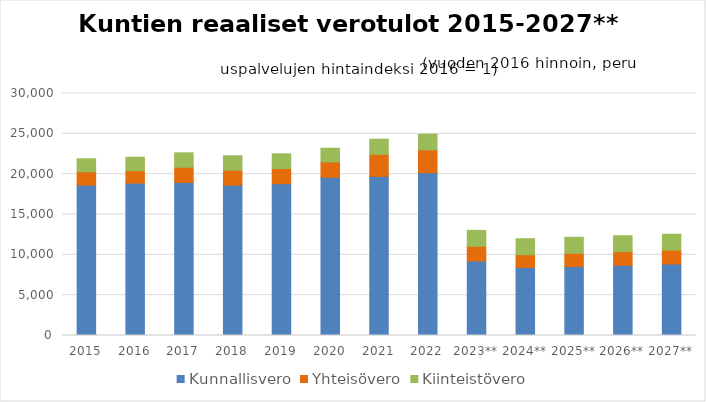
| Category | Kunnallisvero | Yhteisövero | Kiinteistövero |
|---|---|---|---|
| 2015 | 18646.898 | 1652.438 | 1604.013 |
| 2016 | 18890.563 | 1537.872 | 1669.703 |
| 2017 | 18984.903 | 1876.821 | 1781.79 |
| 2018 | 18637.434 | 1845.137 | 1801.77 |
| 2019 | 18825.284 | 1868.046 | 1830.346 |
| 2020 | 19613.622 | 1907.626 | 1694.608 |
| 2021 | 19729.802 | 2724.595 | 1879.564 |
| 2022 | 20180.604 | 2827.179 | 1944.423 |
| 2023** | 9235.781 | 1827.448 | 1970.778 |
| 2024** | 8443.341 | 1571.058 | 1983.571 |
| 2025** | 8557.106 | 1632.38 | 1984.63 |
| 2026** | 8710.951 | 1678.411 | 1980.525 |
| 2027** | 8855.195 | 1723.439 | 1977.852 |